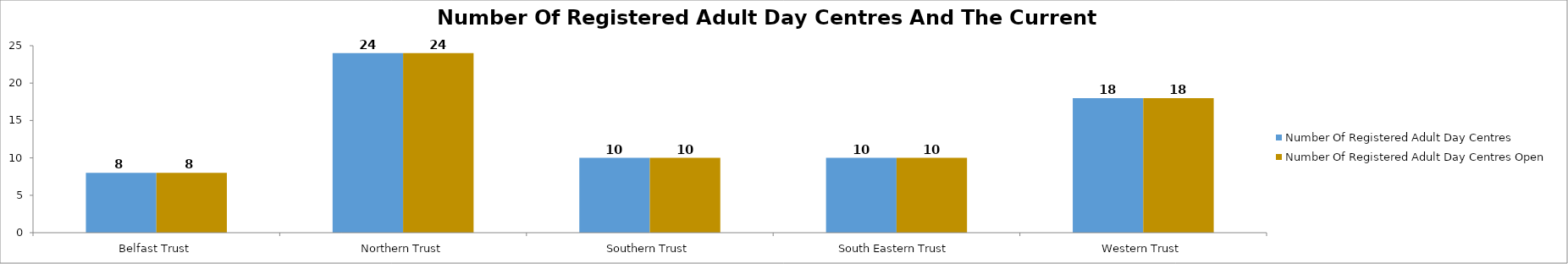
| Category | Number Of Registered Adult Day Centres | Number Of Registered Adult Day Centres Open |
|---|---|---|
| Belfast Trust | 8 | 8 |
| Northern Trust | 24 | 24 |
| Southern Trust | 10 | 10 |
| South Eastern Trust | 10 | 10 |
| Western Trust | 18 | 18 |